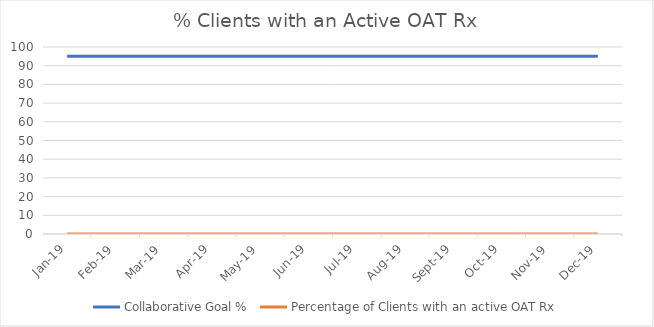
| Category | Collaborative Goal % | Percentage of Clients with an active OAT Rx |
|---|---|---|
| 2019-01-01 | 95 | 0 |
| 2019-02-01 | 95 | 0 |
| 2019-03-01 | 95 | 0 |
| 2019-04-01 | 95 | 0 |
| 2019-05-01 | 95 | 0 |
| 2019-06-01 | 95 | 0 |
| 2019-07-01 | 95 | 0 |
| 2019-08-01 | 95 | 0 |
| 2019-09-01 | 95 | 0 |
| 2019-10-01 | 95 | 0 |
| 2019-11-01 | 95 | 0 |
| 2019-12-01 | 95 | 0 |